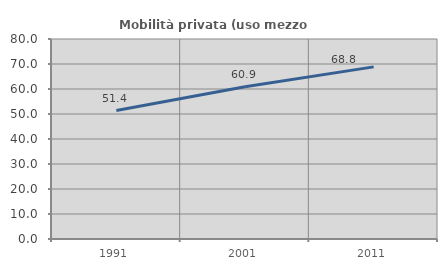
| Category | Mobilità privata (uso mezzo privato) |
|---|---|
| 1991.0 | 51.389 |
| 2001.0 | 60.882 |
| 2011.0 | 68.847 |